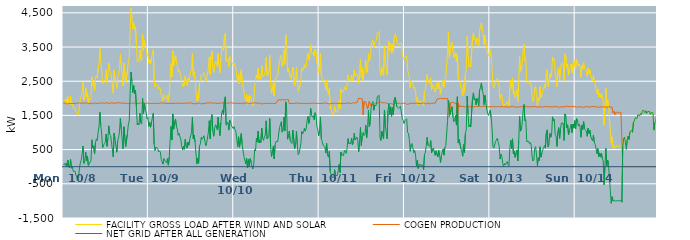
| Category | FACILITY GROSS LOAD AFTER WIND AND SOLAR | COGEN PRODUCTION | NET GRID AFTER ALL GENERATION |
|---|---|---|---|
|  Mon  10/8 | 1916 | 1858 | 58 |
|  Mon  10/8 | 1954 | 1864 | 90 |
|  Mon  10/8 | 1905 | 1864 | 41 |
|  Mon  10/8 | 1982 | 1869 | 113 |
|  Mon  10/8 | 1825 | 1829 | -4 |
|  Mon  10/8 | 2046 | 1855 | 191 |
|  Mon  10/8 | 1863 | 1859 | 4 |
|  Mon  10/8 | 1815 | 1852 | -37 |
|  Mon  10/8 | 2062 | 1845 | 217 |
|  Mon  10/8 | 1803 | 1845 | -42 |
|  Mon  10/8 | 1870 | 1849 | 21 |
|  Mon  10/8 | 1719 | 1852 | -133 |
|  Mon  10/8 | 1719 | 1853 | -134 |
|  Mon  10/8 | 1723 | 1854 | -131 |
|  Mon  10/8 | 1598 | 1844 | -246 |
|  Mon  10/8 | 1568 | 1858 | -290 |
|  Mon  10/8 | 1499 | 1867 | -368 |
|  Mon  10/8 | 1539 | 1866 | -327 |
|  Mon  10/8 | 1831 | 1863 | -32 |
|  Mon  10/8 | 1964 | 1862 | 102 |
|  Mon  10/8 | 2047 | 1858 | 189 |
|  Mon  10/8 | 2208 | 1838 | 370 |
|  Mon  10/8 | 2467 | 1862 | 605 |
|  Mon  10/8 | 1945 | 1851 | 94 |
|  Mon  10/8 | 2002 | 1858 | 144 |
|  Mon  10/8 | 2306 | 1879 | 427 |
|  Mon  10/8 | 2045 | 1870 | 175 |
|  Mon  10/8 | 2175 | 1864 | 311 |
|  Mon  10/8 | 1878 | 1841 | 37 |
|  Mon  10/8 | 1938 | 1856 | 82 |
|  Mon  10/8 | 1921 | 1861 | 60 |
|  Mon  10/8 | 2025 | 1837 | 188 |
|  Mon  10/8 | 2629 | 1840 | 789 |
|  Mon  10/8 | 2388 | 1840 | 548 |
|  Mon  10/8 | 2460 | 1851 | 609 |
|  Mon  10/8 | 2218 | 1845 | 373 |
|  Mon  10/8 | 2560 | 1864 | 696 |
|  Mon  10/8 | 2677 | 1863 | 814 |
|  Mon  10/8 | 2604 | 1840 | 764 |
|  Mon  10/8 | 2855 | 1854 | 1001 |
|  Mon  10/8 | 3028 | 1864 | 1164 |
|  Mon  10/8 | 3457 | 1863 | 1594 |
|  Mon  10/8 | 3061 | 1859 | 1202 |
|  Mon  10/8 | 2814 | 1862 | 952 |
|  Mon  10/8 | 2429 | 1870 | 559 |
|  Mon  10/8 | 2475 | 1851 | 624 |
|  Mon  10/8 | 2520 | 1847 | 673 |
|  Mon  10/8 | 2567 | 1855 | 712 |
|  Mon  10/8 | 2832 | 1875 | 957 |
|  Mon  10/8 | 2453 | 1855 | 598 |
|  Mon  10/8 | 2678 | 1850 | 828 |
|  Mon  10/8 | 3032 | 1835 | 1197 |
|  Mon  10/8 | 2811 | 1860 | 951 |
|  Mon  10/8 | 2771 | 1858 | 913 |
|  Mon  10/8 | 2593 | 1868 | 725 |
|  Mon  10/8 | 2585 | 1857 | 728 |
|  Mon  10/8 | 2148 | 1864 | 284 |
|  Mon  10/8 | 2828 | 1845 | 983 |
|  Mon  10/8 | 2646 | 1852 | 794 |
|  Mon  10/8 | 2648 | 1845 | 803 |
|  Mon  10/8 | 2292 | 1869 | 423 |
|  Mon  10/8 | 2605 | 1850 | 755 |
|  Mon  10/8 | 2713 | 1868 | 845 |
|  Mon  10/8 | 2859 | 1840 | 1019 |
|  Mon  10/8 | 3284 | 1870 | 1414 |
|  Mon  10/8 | 2964 | 1855 | 1109 |
|  Mon  10/8 | 2939 | 1850 | 1089 |
|  Mon  10/8 | 2366 | 1846 | 520 |
|  Mon  10/8 | 3030 | 1861 | 1169 |
|  Mon  10/8 | 3041 | 1856 | 1185 |
|  Mon  10/8 | 2445 | 1857 | 588 |
|  Mon  10/8 | 2440 | 1850 | 590 |
|  Mon  10/8 | 2817 | 1847 | 970 |
|  Mon  10/8 | 3097 | 1853 | 1244 |
|  Mon  10/8 | 3181 | 1843 | 1338 |
|  Mon  10/8 | 4002 | 1862 | 2140 |
|  Mon  10/8 | 4632 | 1862 | 2770 |
|  Mon  10/8 | 4355 | 1852 | 2503 |
|  Mon  10/8 | 4017 | 1850 | 2167 |
|  Mon  10/8 | 4204 | 1833 | 2371 |
|  Mon  10/8 | 4003 | 1864 | 2139 |
|  Mon  10/8 | 4082 | 1845 | 2237 |
|  Mon  10/8 | 3613 | 1854 | 1759 |
|  Mon  10/8 | 3076 | 1855 | 1221 |
|  Mon  10/8 | 3118 | 1845 | 1273 |
|  Mon  10/8 | 3082 | 1859 | 1223 |
|  Mon  10/8 | 3428 | 1864 | 1564 |
|  Mon  10/8 | 3139 | 1855 | 1284 |
|  Mon  10/8 | 3108 | 1861 | 1247 |
|  Mon  10/8 | 3863 | 1864 | 1999 |
|  Mon  10/8 | 3408 | 1854 | 1554 |
|  Mon  10/8 | 3697 | 1835 | 1862 |
|  Mon  10/8 | 3520 | 1855 | 1665 |
|  Mon  10/8 | 3458 | 1860 | 1598 |
|  Mon  10/8 | 3262 | 1863 | 1399 |
|  Mon  10/8 | 3296 | 1855 | 1441 |
|  Tue  10/9 | 3029 | 1852 | 1177 |
|  Tue  10/9 | 3132 | 1838 | 1294 |
|  Tue  10/9 | 2998 | 1842 | 1156 |
|  Tue  10/9 | 3168 | 1870 | 1298 |
|  Tue  10/9 | 3157 | 1857 | 1300 |
|  Tue  10/9 | 3418 | 1855 | 1563 |
|  Tue  10/9 | 2508 | 1850 | 658 |
|  Tue  10/9 | 2326 | 1849 | 477 |
|  Tue  10/9 | 2414 | 1842 | 572 |
|  Tue  10/9 | 2391 | 1843 | 548 |
|  Tue  10/9 | 2389 | 1853 | 536 |
|  Tue  10/9 | 2272 | 1841 | 431 |
|  Tue  10/9 | 2312 | 1849 | 463 |
|  Tue  10/9 | 2280 | 1851 | 429 |
|  Tue  10/9 | 2083 | 1869 | 214 |
|  Tue  10/9 | 2067 | 1859 | 208 |
|  Tue  10/9 | 1937 | 1862 | 75 |
|  Tue  10/9 | 2107 | 1871 | 236 |
|  Tue  10/9 | 2041 | 1859 | 182 |
|  Tue  10/9 | 2028 | 1856 | 172 |
|  Tue  10/9 | 1965 | 1850 | 115 |
|  Tue  10/9 | 2098 | 1862 | 236 |
|  Tue  10/9 | 1895 | 1848 | 47 |
|  Tue  10/9 | 2135 | 1851 | 284 |
|  Tue  10/9 | 2615 | 1855 | 760 |
|  Tue  10/9 | 3014 | 1837 | 1177 |
|  Tue  10/9 | 2629 | 1850 | 779 |
|  Tue  10/9 | 3391 | 1847 | 1544 |
|  Tue  10/9 | 2953 | 1855 | 1098 |
|  Tue  10/9 | 3174 | 1867 | 1307 |
|  Tue  10/9 | 3247 | 1854 | 1393 |
|  Tue  10/9 | 3057 | 1868 | 1189 |
|  Tue  10/9 | 2959 | 1855 | 1104 |
|  Tue  10/9 | 2778 | 1859 | 919 |
|  Tue  10/9 | 2840 | 1863 | 977 |
|  Tue  10/9 | 2823 | 1855 | 968 |
|  Tue  10/9 | 2643 | 1852 | 791 |
|  Tue  10/9 | 2454 | 1842 | 612 |
|  Tue  10/9 | 2338 | 1850 | 488 |
|  Tue  10/9 | 2445 | 1847 | 598 |
|  Tue  10/9 | 2370 | 1859 | 511 |
|  Tue  10/9 | 2658 | 1859 | 799 |
|  Tue  10/9 | 2468 | 1857 | 611 |
|  Tue  10/9 | 2385 | 1842 | 543 |
|  Tue  10/9 | 2581 | 1860 | 721 |
|  Tue  10/9 | 2473 | 1845 | 628 |
|  Tue  10/9 | 2660 | 1868 | 792 |
|  Tue  10/9 | 2631 | 1848 | 783 |
|  Tue  10/9 | 2863 | 1858 | 1005 |
|  Tue  10/9 | 3316 | 1866 | 1450 |
|  Tue  10/9 | 2661 | 1843 | 818 |
|  Tue  10/9 | 2788 | 1861 | 927 |
|  Tue  10/9 | 2562 | 1840 | 722 |
|  Tue  10/9 | 2589 | 1867 | 722 |
|  Tue  10/9 | 1919 | 1842 | 77 |
|  Tue  10/9 | 2103 | 1856 | 247 |
|  Tue  10/9 | 1963 | 1861 | 102 |
|  Tue  10/9 | 2458 | 1852 | 606 |
|  Tue  10/9 | 2527 | 1859 | 668 |
|  Tue  10/9 | 2683 | 1824 | 859 |
|  Tue  10/9 | 2652 | 1852 | 800 |
|  Tue  10/9 | 2687 | 1859 | 828 |
|  Tue  10/9 | 2761 | 1856 | 905 |
|  Tue  10/9 | 2723 | 1846 | 877 |
|  Tue  10/9 | 2473 | 1858 | 615 |
|  Tue  10/9 | 2555 | 1867 | 688 |
|  Tue  10/9 | 2534 | 1853 | 681 |
|  Tue  10/9 | 2866 | 1857 | 1009 |
|  Tue  10/9 | 3198 | 1854 | 1344 |
|  Tue  10/9 | 2695 | 1880 | 815 |
|  Tue  10/9 | 3242 | 1865 | 1377 |
|  Tue  10/9 | 3379 | 1854 | 1525 |
|  Tue  10/9 | 2906 | 1869 | 1037 |
|  Tue  10/9 | 2753 | 1862 | 891 |
|  Tue  10/9 | 2963 | 1852 | 1111 |
|  Tue  10/9 | 3089 | 1862 | 1227 |
|  Tue  10/9 | 3044 | 1852 | 1192 |
|  Tue  10/9 | 2925 | 1848 | 1077 |
|  Tue  10/9 | 3304 | 1852 | 1452 |
|  Tue  10/9 | 2970 | 1855 | 1115 |
|  Tue  10/9 | 2755 | 1846 | 909 |
|  Tue  10/9 | 3160 | 1870 | 1290 |
|  Tue  10/9 | 3436 | 1861 | 1575 |
|  Tue  10/9 | 3513 | 1856 | 1657 |
|  Tue  10/9 | 3392 | 1862 | 1530 |
|  Tue  10/9 | 3798 | 1872 | 1926 |
|  Tue  10/9 | 3895 | 1850 | 2045 |
|  Tue  10/9 | 3068 | 1853 | 1215 |
|  Tue  10/9 | 3064 | 1849 | 1215 |
|  Tue  10/9 | 3164 | 1857 | 1307 |
|  Tue  10/9 | 2926 | 1856 | 1070 |
|  Tue  10/9 | 3224 | 1865 | 1359 |
|  Tue  10/9 | 3163 | 1865 | 1298 |
|  Tue  10/9 | 3064 | 1870 | 1194 |
|  Tue  10/9 | 3067 | 1868 | 1199 |
|  Tue  10/9 | 2973 | 1859 | 1114 |
|  Wed  10/10 | 3030 | 1856 | 1174 |
|  Wed  10/10 | 2926 | 1851 | 1075 |
|  Wed  10/10 | 2868 | 1848 | 1020 |
|  Wed  10/10 | 2844 | 1853 | 991 |
|  Wed  10/10 | 2446 | 1862 | 584 |
|  Wed  10/10 | 2725 | 1850 | 875 |
|  Wed  10/10 | 2425 | 1860 | 565 |
|  Wed  10/10 | 2408 | 1853 | 555 |
|  Wed  10/10 | 2833 | 1862 | 971 |
|  Wed  10/10 | 2499 | 1849 | 650 |
|  Wed  10/10 | 2318 | 1854 | 464 |
|  Wed  10/10 | 2180 | 1881 | 299 |
|  Wed  10/10 | 2031 | 1837 | 194 |
|  Wed  10/10 | 1935 | 1855 | 80 |
|  Wed  10/10 | 2114 | 1869 | 245 |
|  Wed  10/10 | 1815 | 1848 | -33 |
|  Wed  10/10 | 2068 | 1858 | 210 |
|  Wed  10/10 | 1859 | 1847 | 12 |
|  Wed  10/10 | 2088 | 1848 | 240 |
|  Wed  10/10 | 1999 | 1854 | 145 |
|  Wed  10/10 | 1859 | 1863 | -4 |
|  Wed  10/10 | 1783 | 1852 | -69 |
|  Wed  10/10 | 1930 | 1861 | 69 |
|  Wed  10/10 | 2348 | 1850 | 498 |
|  Wed  10/10 | 2331 | 1868 | 463 |
|  Wed  10/10 | 2685 | 1854 | 831 |
|  Wed  10/10 | 2577 | 1857 | 720 |
|  Wed  10/10 | 2890 | 1847 | 1043 |
|  Wed  10/10 | 2550 | 1854 | 696 |
|  Wed  10/10 | 2640 | 1865 | 775 |
|  Wed  10/10 | 2568 | 1861 | 707 |
|  Wed  10/10 | 2955 | 1827 | 1128 |
|  Wed  10/10 | 2691 | 1853 | 838 |
|  Wed  10/10 | 2621 | 1851 | 770 |
|  Wed  10/10 | 2712 | 1839 | 873 |
|  Wed  10/10 | 2789 | 1859 | 930 |
|  Wed  10/10 | 3205 | 1863 | 1342 |
|  Wed  10/10 | 2656 | 1841 | 815 |
|  Wed  10/10 | 2660 | 1863 | 797 |
|  Wed  10/10 | 2743 | 1860 | 883 |
|  Wed  10/10 | 3264 | 1851 | 1413 |
|  Wed  10/10 | 2429 | 1847 | 582 |
|  Wed  10/10 | 2151 | 1855 | 296 |
|  Wed  10/10 | 2303 | 1852 | 451 |
|  Wed  10/10 | 2455 | 1854 | 601 |
|  Wed  10/10 | 2075 | 1846 | 229 |
|  Wed  10/10 | 2503 | 1862 | 641 |
|  Wed  10/10 | 2591 | 1855 | 736 |
|  Wed  10/10 | 2594 | 1856 | 738 |
|  Wed  10/10 | 2679 | 1945 | 734 |
|  Wed  10/10 | 2708 | 1968 | 740 |
|  Wed  10/10 | 3101 | 1954 | 1147 |
|  Wed  10/10 | 3182 | 1957 | 1225 |
|  Wed  10/10 | 3267 | 1954 | 1313 |
|  Wed  10/10 | 2940 | 1930 | 1010 |
|  Wed  10/10 | 3012 | 1960 | 1052 |
|  Wed  10/10 | 3414 | 1964 | 1450 |
|  Wed  10/10 | 2997 | 1951 | 1046 |
|  Wed  10/10 | 3857 | 1962 | 1895 |
|  Wed  10/10 | 3615 | 1964 | 1651 |
|  Wed  10/10 | 2764 | 1959 | 805 |
|  Wed  10/10 | 2871 | 1959 | 912 |
|  Wed  10/10 | 2886 | 1843 | 1043 |
|  Wed  10/10 | 2631 | 1858 | 773 |
|  Wed  10/10 | 2559 | 1851 | 708 |
|  Wed  10/10 | 2549 | 1871 | 678 |
|  Wed  10/10 | 2916 | 1846 | 1070 |
|  Wed  10/10 | 2940 | 1857 | 1083 |
|  Wed  10/10 | 2376 | 1853 | 523 |
|  Wed  10/10 | 2498 | 1854 | 644 |
|  Wed  10/10 | 2905 | 1862 | 1043 |
|  Wed  10/10 | 2525 | 1881 | 644 |
|  Wed  10/10 | 2208 | 1860 | 348 |
|  Wed  10/10 | 2253 | 1861 | 392 |
|  Wed  10/10 | 2243 | 1840 | 403 |
|  Wed  10/10 | 2522 | 1851 | 671 |
|  Wed  10/10 | 2887 | 1858 | 1029 |
|  Wed  10/10 | 2820 | 1858 | 962 |
|  Wed  10/10 | 2852 | 1850 | 1002 |
|  Wed  10/10 | 2986 | 1854 | 1132 |
|  Wed  10/10 | 2885 | 1846 | 1039 |
|  Wed  10/10 | 2945 | 1828 | 1117 |
|  Wed  10/10 | 3197 | 1859 | 1338 |
|  Wed  10/10 | 3328 | 1852 | 1476 |
|  Wed  10/10 | 3117 | 1848 | 1269 |
|  Wed  10/10 | 3222 | 1843 | 1379 |
|  Wed  10/10 | 3564 | 1856 | 1708 |
|  Wed  10/10 | 3369 | 1853 | 1516 |
|  Wed  10/10 | 3303 | 1856 | 1447 |
|  Wed  10/10 | 3344 | 1850 | 1494 |
|  Wed  10/10 | 3230 | 1862 | 1368 |
|  Wed  10/10 | 3441 | 1861 | 1580 |
|  Wed  10/10 | 3372 | 1842 | 1530 |
|  Wed  10/10 | 3022 | 1845 | 1177 |
|  Wed  10/10 | 2950 | 1854 | 1096 |
|  Wed  10/10 | 2757 | 1855 | 902 |
|  Thu  10/11 | 2899 | 1850 | 1049 |
|  Thu  10/11 | 3320 | 1863 | 1457 |
|  Thu  10/11 | 2670 | 1851 | 819 |
|  Thu  10/11 | 2589 | 1855 | 734 |
|  Thu  10/11 | 2483 | 1851 | 632 |
|  Thu  10/11 | 2489 | 1843 | 646 |
|  Thu  10/11 | 2450 | 1865 | 585 |
|  Thu  10/11 | 2248 | 1849 | 399 |
|  Thu  10/11 | 2540 | 1857 | 683 |
|  Thu  10/11 | 2201 | 1862 | 339 |
|  Thu  10/11 | 2117 | 1839 | 278 |
|  Thu  10/11 | 2302 | 1852 | 450 |
|  Thu  10/11 | 1695 | 1840 | -145 |
|  Thu  10/11 | 1745 | 1861 | -116 |
|  Thu  10/11 | 1565 | 1852 | -287 |
|  Thu  10/11 | 1513 | 1841 | -328 |
|  Thu  10/11 | 1571 | 1860 | -289 |
|  Thu  10/11 | 1762 | 1849 | -87 |
|  Thu  10/11 | 1595 | 1852 | -257 |
|  Thu  10/11 | 1584 | 1849 | -265 |
|  Thu  10/11 | 1601 | 1857 | -256 |
|  Thu  10/11 | 1734 | 1854 | -120 |
|  Thu  10/11 | 1926 | 1858 | 68 |
|  Thu  10/11 | 1691 | 1859 | -168 |
|  Thu  10/11 | 2273 | 1843 | 430 |
|  Thu  10/11 | 2187 | 1857 | 330 |
|  Thu  10/11 | 2215 | 1852 | 363 |
|  Thu  10/11 | 2195 | 1871 | 324 |
|  Thu  10/11 | 2340 | 1852 | 488 |
|  Thu  10/11 | 2369 | 1862 | 507 |
|  Thu  10/11 | 2241 | 1849 | 392 |
|  Thu  10/11 | 2402 | 1864 | 538 |
|  Thu  10/11 | 2690 | 1869 | 821 |
|  Thu  10/11 | 2521 | 1847 | 674 |
|  Thu  10/11 | 2502 | 1853 | 649 |
|  Thu  10/11 | 2535 | 1857 | 678 |
|  Thu  10/11 | 2686 | 1849 | 837 |
|  Thu  10/11 | 2508 | 1872 | 636 |
|  Thu  10/11 | 2607 | 1869 | 738 |
|  Thu  10/11 | 2829 | 1849 | 980 |
|  Thu  10/11 | 2644 | 1864 | 780 |
|  Thu  10/11 | 2637 | 1855 | 782 |
|  Thu  10/11 | 2735 | 1869 | 866 |
|  Thu  10/11 | 2610 | 1843 | 767 |
|  Thu  10/11 | 2441 | 2004 | 437 |
|  Thu  10/11 | 2735 | 1994 | 741 |
|  Thu  10/11 | 3139 | 1991 | 1148 |
|  Thu  10/11 | 2607 | 1985 | 622 |
|  Thu  10/11 | 2894 | 1989 | 905 |
|  Thu  10/11 | 2517 | 1515 | 1002 |
|  Thu  10/11 | 2811 | 1905 | 906 |
|  Thu  10/11 | 2852 | 1912 | 940 |
|  Thu  10/11 | 3107 | 1895 | 1212 |
|  Thu  10/11 | 2750 | 1901 | 849 |
|  Thu  10/11 | 2796 | 1688 | 1108 |
|  Thu  10/11 | 3313 | 1666 | 1647 |
|  Thu  10/11 | 3087 | 1914 | 1173 |
|  Thu  10/11 | 3203 | 1905 | 1298 |
|  Thu  10/11 | 3507 | 1774 | 1733 |
|  Thu  10/11 | 3660 | 1813 | 1847 |
|  Thu  10/11 | 3714 | 1811 | 1903 |
|  Thu  10/11 | 3476 | 1823 | 1653 |
|  Thu  10/11 | 3647 | 1843 | 1804 |
|  Thu  10/11 | 3629 | 1856 | 1773 |
|  Thu  10/11 | 3694 | 1858 | 1836 |
|  Thu  10/11 | 3907 | 1854 | 2053 |
|  Thu  10/11 | 3923 | 1848 | 2075 |
|  Thu  10/11 | 3960 | 1875 | 2085 |
|  Thu  10/11 | 2759 | 1892 | 867 |
|  Thu  10/11 | 2665 | 1898 | 767 |
|  Thu  10/11 | 2909 | 1869 | 1040 |
|  Thu  10/11 | 2755 | 1859 | 896 |
|  Thu  10/11 | 2661 | 1845 | 816 |
|  Thu  10/11 | 3540 | 1881 | 1659 |
|  Thu  10/11 | 3077 | 1852 | 1225 |
|  Thu  10/11 | 2862 | 1854 | 1008 |
|  Thu  10/11 | 2681 | 1864 | 817 |
|  Thu  10/11 | 3492 | 1850 | 1642 |
|  Thu  10/11 | 3676 | 1846 | 1830 |
|  Thu  10/11 | 3374 | 1850 | 1524 |
|  Thu  10/11 | 3602 | 1853 | 1749 |
|  Thu  10/11 | 3312 | 1842 | 1470 |
|  Thu  10/11 | 3574 | 1847 | 1727 |
|  Thu  10/11 | 3346 | 1825 | 1521 |
|  Thu  10/11 | 3802 | 1848 | 1954 |
|  Thu  10/11 | 3883 | 1850 | 2033 |
|  Thu  10/11 | 3845 | 1840 | 2005 |
|  Thu  10/11 | 3607 | 1850 | 1757 |
|  Thu  10/11 | 3583 | 1850 | 1733 |
|  Thu  10/11 | 3567 | 1862 | 1705 |
|  Thu  10/11 | 3607 | 1869 | 1738 |
|  Thu  10/11 | 3607 | 1839 | 1768 |
|  Thu  10/11 | 3613 | 1844 | 1769 |
|  Thu  10/11 | 3266 | 1849 | 1417 |
|  Thu  10/11 | 3194 | 1837 | 1357 |
|  Thu  10/11 | 3126 | 1863 | 1263 |
|  Fri  10/12 | 3202 | 1859 | 1343 |
|  Fri  10/12 | 3211 | 1839 | 1372 |
|  Fri  10/12 | 3242 | 1843 | 1399 |
|  Fri  10/12 | 2833 | 1826 | 1007 |
|  Fri  10/12 | 2821 | 1846 | 975 |
|  Fri  10/12 | 2635 | 1840 | 795 |
|  Fri  10/12 | 2304 | 1853 | 451 |
|  Fri  10/12 | 2514 | 1864 | 650 |
|  Fri  10/12 | 2522 | 1842 | 680 |
|  Fri  10/12 | 2395 | 1844 | 551 |
|  Fri  10/12 | 2277 | 1871 | 406 |
|  Fri  10/12 | 2331 | 1855 | 476 |
|  Fri  10/12 | 2193 | 1855 | 338 |
|  Fri  10/12 | 1881 | 1864 | 17 |
|  Fri  10/12 | 2029 | 1836 | 193 |
|  Fri  10/12 | 1799 | 1848 | -49 |
|  Fri  10/12 | 1869 | 1848 | 21 |
|  Fri  10/12 | 1934 | 1855 | 79 |
|  Fri  10/12 | 1878 | 1841 | 37 |
|  Fri  10/12 | 1869 | 1849 | 20 |
|  Fri  10/12 | 1892 | 1842 | 50 |
|  Fri  10/12 | 1782 | 1868 | -86 |
|  Fri  10/12 | 2200 | 1858 | 342 |
|  Fri  10/12 | 2268 | 1844 | 424 |
|  Fri  10/12 | 2432 | 1830 | 602 |
|  Fri  10/12 | 2691 | 1834 | 857 |
|  Fri  10/12 | 2499 | 1873 | 626 |
|  Fri  10/12 | 2495 | 1865 | 630 |
|  Fri  10/12 | 2427 | 1838 | 589 |
|  Fri  10/12 | 2603 | 1835 | 768 |
|  Fri  10/12 | 2263 | 1854 | 409 |
|  Fri  10/12 | 2253 | 1863 | 390 |
|  Fri  10/12 | 2406 | 1858 | 548 |
|  Fri  10/12 | 2418 | 1849 | 569 |
|  Fri  10/12 | 2181 | 1852 | 329 |
|  Fri  10/12 | 2324 | 1860 | 464 |
|  Fri  10/12 | 2454 | 1973 | 481 |
|  Fri  10/12 | 2274 | 1987 | 287 |
|  Fri  10/12 | 2464 | 1988 | 476 |
|  Fri  10/12 | 2325 | 1992 | 333 |
|  Fri  10/12 | 2120 | 1998 | 122 |
|  Fri  10/12 | 2318 | 1995 | 323 |
|  Fri  10/12 | 2426 | 1996 | 430 |
|  Fri  10/12 | 2514 | 1997 | 517 |
|  Fri  10/12 | 2326 | 1988 | 338 |
|  Fri  10/12 | 2545 | 1982 | 563 |
|  Fri  10/12 | 2616 | 1994 | 622 |
|  Fri  10/12 | 2629 | 1996 | 633 |
|  Fri  10/12 | 3341 | 1996 | 1345 |
|  Fri  10/12 | 3938 | 2000 | 1938 |
|  Fri  10/12 | 3168 | 1450 | 1718 |
|  Fri  10/12 | 3386 | 1864 | 1522 |
|  Fri  10/12 | 3569 | 1885 | 1684 |
|  Fri  10/12 | 3636 | 1881 | 1755 |
|  Fri  10/12 | 3367 | 1906 | 1461 |
|  Fri  10/12 | 3196 | 1880 | 1316 |
|  Fri  10/12 | 3219 | 1848 | 1371 |
|  Fri  10/12 | 3349 | 1854 | 1495 |
|  Fri  10/12 | 3077 | 1860 | 1217 |
|  Fri  10/12 | 3295 | 1249 | 2046 |
|  Fri  10/12 | 2559 | 1868 | 691 |
|  Fri  10/12 | 2559 | 1760 | 799 |
|  Fri  10/12 | 2524 | 1750 | 774 |
|  Fri  10/12 | 2288 | 1766 | 522 |
|  Fri  10/12 | 2208 | 1760 | 448 |
|  Fri  10/12 | 2072 | 1765 | 307 |
|  Fri  10/12 | 2409 | 1761 | 648 |
|  Fri  10/12 | 2167 | 1751 | 416 |
|  Fri  10/12 | 2727 | 1758 | 969 |
|  Fri  10/12 | 2830 | 1751 | 1079 |
|  Fri  10/12 | 3817 | 1751 | 2066 |
|  Fri  10/12 | 3302 | 1753 | 1549 |
|  Fri  10/12 | 2922 | 1755 | 1167 |
|  Fri  10/12 | 2976 | 1755 | 1221 |
|  Fri  10/12 | 2921 | 1756 | 1165 |
|  Fri  10/12 | 2938 | 1756 | 1182 |
|  Fri  10/12 | 3763 | 1772 | 1991 |
|  Fri  10/12 | 3912 | 1750 | 2162 |
|  Fri  10/12 | 3711 | 1759 | 1952 |
|  Fri  10/12 | 3745 | 1756 | 1989 |
|  Fri  10/12 | 3574 | 1762 | 1812 |
|  Fri  10/12 | 3756 | 1761 | 1995 |
|  Fri  10/12 | 3684 | 1760 | 1924 |
|  Fri  10/12 | 3540 | 1760 | 1780 |
|  Fri  10/12 | 3985 | 1750 | 2235 |
|  Fri  10/12 | 4077 | 1753 | 2324 |
|  Fri  10/12 | 4206 | 1755 | 2451 |
|  Fri  10/12 | 3998 | 1767 | 2231 |
|  Fri  10/12 | 3895 | 1751 | 2144 |
|  Fri  10/12 | 3579 | 1766 | 1813 |
|  Fri  10/12 | 3850 | 1762 | 2088 |
|  Fri  10/12 | 3654 | 1759 | 1895 |
|  Fri  10/12 | 3450 | 1761 | 1689 |
|  Fri  10/12 | 3320 | 1755 | 1565 |
|  Fri  10/12 | 3238 | 1738 | 1500 |
|  Fri  10/12 | 3257 | 1747 | 1510 |
|  Sat  10/13 | 3422 | 1769 | 1653 |
|  Sat  10/13 | 3205 | 1761 | 1444 |
|  Sat  10/13 | 2871 | 1738 | 1133 |
|  Sat  10/13 | 2354 | 1755 | 599 |
|  Sat  10/13 | 2305 | 1758 | 547 |
|  Sat  10/13 | 2307 | 1753 | 554 |
|  Sat  10/13 | 2483 | 1748 | 735 |
|  Sat  10/13 | 2475 | 1746 | 729 |
|  Sat  10/13 | 2592 | 1756 | 836 |
|  Sat  10/13 | 2471 | 1763 | 708 |
|  Sat  10/13 | 2364 | 1755 | 609 |
|  Sat  10/13 | 1970 | 1746 | 224 |
|  Sat  10/13 | 2117 | 1752 | 365 |
|  Sat  10/13 | 2072 | 1767 | 305 |
|  Sat  10/13 | 1855 | 1756 | 99 |
|  Sat  10/13 | 1760 | 1752 | 8 |
|  Sat  10/13 | 1839 | 1745 | 94 |
|  Sat  10/13 | 1802 | 1750 | 52 |
|  Sat  10/13 | 1777 | 1748 | 29 |
|  Sat  10/13 | 1904 | 1752 | 152 |
|  Sat  10/13 | 1818 | 1754 | 64 |
|  Sat  10/13 | 1766 | 1741 | 25 |
|  Sat  10/13 | 2295 | 1766 | 529 |
|  Sat  10/13 | 2536 | 1759 | 777 |
|  Sat  10/13 | 2282 | 1759 | 523 |
|  Sat  10/13 | 2581 | 1766 | 815 |
|  Sat  10/13 | 2139 | 1757 | 382 |
|  Sat  10/13 | 2201 | 1751 | 450 |
|  Sat  10/13 | 2019 | 1745 | 274 |
|  Sat  10/13 | 2143 | 1742 | 401 |
|  Sat  10/13 | 2254 | 1764 | 490 |
|  Sat  10/13 | 1908 | 1740 | 168 |
|  Sat  10/13 | 2503 | 1746 | 757 |
|  Sat  10/13 | 3222 | 1751 | 1471 |
|  Sat  10/13 | 2787 | 1747 | 1040 |
|  Sat  10/13 | 2839 | 1754 | 1085 |
|  Sat  10/13 | 3060 | 1755 | 1305 |
|  Sat  10/13 | 3425 | 1749 | 1676 |
|  Sat  10/13 | 3581 | 1761 | 1820 |
|  Sat  10/13 | 3092 | 1753 | 1339 |
|  Sat  10/13 | 3133 | 1760 | 1373 |
|  Sat  10/13 | 2488 | 1754 | 734 |
|  Sat  10/13 | 2446 | 1730 | 716 |
|  Sat  10/13 | 2496 | 1750 | 746 |
|  Sat  10/13 | 2423 | 1746 | 677 |
|  Sat  10/13 | 2460 | 1749 | 711 |
|  Sat  10/13 | 2385 | 1751 | 634 |
|  Sat  10/13 | 2054 | 1763 | 291 |
|  Sat  10/13 | 1911 | 1745 | 166 |
|  Sat  10/13 | 1952 | 1752 | 200 |
|  Sat  10/13 | 2303 | 1760 | 543 |
|  Sat  10/13 | 2352 | 1764 | 588 |
|  Sat  10/13 | 2112 | 1764 | 348 |
|  Sat  10/13 | 1774 | 1742 | 32 |
|  Sat  10/13 | 2015 | 1754 | 261 |
|  Sat  10/13 | 1937 | 1759 | 178 |
|  Sat  10/13 | 2342 | 1760 | 582 |
|  Sat  10/13 | 2029 | 1750 | 279 |
|  Sat  10/13 | 2130 | 1739 | 391 |
|  Sat  10/13 | 2235 | 1738 | 497 |
|  Sat  10/13 | 2296 | 1756 | 540 |
|  Sat  10/13 | 2398 | 1773 | 625 |
|  Sat  10/13 | 2283 | 1740 | 543 |
|  Sat  10/13 | 2736 | 1756 | 980 |
|  Sat  10/13 | 2842 | 1764 | 1078 |
|  Sat  10/13 | 2349 | 1769 | 580 |
|  Sat  10/13 | 2413 | 1757 | 656 |
|  Sat  10/13 | 2730 | 1753 | 977 |
|  Sat  10/13 | 2610 | 1746 | 864 |
|  Sat  10/13 | 2702 | 1740 | 962 |
|  Sat  10/13 | 3212 | 1753 | 1459 |
|  Sat  10/13 | 3105 | 1768 | 1337 |
|  Sat  10/13 | 3143 | 1756 | 1387 |
|  Sat  10/13 | 2706 | 1771 | 935 |
|  Sat  10/13 | 2651 | 1751 | 900 |
|  Sat  10/13 | 2345 | 1752 | 593 |
|  Sat  10/13 | 2788 | 1760 | 1028 |
|  Sat  10/13 | 2893 | 1748 | 1145 |
|  Sat  10/13 | 2546 | 1724 | 822 |
|  Sat  10/13 | 2875 | 1761 | 1114 |
|  Sat  10/13 | 3014 | 1738 | 1276 |
|  Sat  10/13 | 3036 | 1743 | 1293 |
|  Sat  10/13 | 3007 | 1736 | 1271 |
|  Sat  10/13 | 2520 | 1751 | 769 |
|  Sat  10/13 | 3303 | 1759 | 1544 |
|  Sat  10/13 | 3253 | 1766 | 1487 |
|  Sat  10/13 | 2886 | 1752 | 1134 |
|  Sat  10/13 | 2991 | 1766 | 1225 |
|  Sat  10/13 | 2688 | 1751 | 937 |
|  Sat  10/13 | 2799 | 1756 | 1043 |
|  Sat  10/13 | 2908 | 1758 | 1150 |
|  Sat  10/13 | 3003 | 1764 | 1239 |
|  Sat  10/13 | 2750 | 1750 | 1000 |
|  Sat  10/13 | 3008 | 1759 | 1249 |
|  Sat  10/13 | 2899 | 1771 | 1128 |
|  Sat  10/13 | 3102 | 1755 | 1347 |
|  Sun  10/14 | 2878 | 1768 | 1110 |
|  Sun  10/14 | 3146 | 1737 | 1409 |
|  Sun  10/14 | 3118 | 1742 | 1376 |
|  Sun  10/14 | 2949 | 1754 | 1195 |
|  Sun  10/14 | 3003 | 1749 | 1254 |
|  Sun  10/14 | 2893 | 1748 | 1145 |
|  Sun  10/14 | 2616 | 1754 | 862 |
|  Sun  10/14 | 2961 | 1744 | 1217 |
|  Sun  10/14 | 2841 | 1756 | 1085 |
|  Sun  10/14 | 3054 | 1736 | 1318 |
|  Sun  10/14 | 2871 | 1760 | 1111 |
|  Sun  10/14 | 2862 | 1762 | 1100 |
|  Sun  10/14 | 2790 | 1747 | 1043 |
|  Sun  10/14 | 2642 | 1752 | 890 |
|  Sun  10/14 | 2880 | 1758 | 1122 |
|  Sun  10/14 | 2714 | 1741 | 973 |
|  Sun  10/14 | 2831 | 1762 | 1069 |
|  Sun  10/14 | 2632 | 1753 | 879 |
|  Sun  10/14 | 2622 | 1762 | 860 |
|  Sun  10/14 | 2514 | 1761 | 753 |
|  Sun  10/14 | 2675 | 1750 | 925 |
|  Sun  10/14 | 2467 | 1752 | 715 |
|  Sun  10/14 | 2416 | 1762 | 654 |
|  Sun  10/14 | 2282 | 1763 | 519 |
|  Sun  10/14 | 2137 | 1756 | 381 |
|  Sun  10/14 | 2268 | 1738 | 530 |
|  Sun  10/14 | 2043 | 1749 | 294 |
|  Sun  10/14 | 2146 | 1743 | 403 |
|  Sun  10/14 | 2023 | 1742 | 281 |
|  Sun  10/14 | 2149 | 1755 | 394 |
|  Sun  10/14 | 1992 | 1750 | 242 |
|  Sun  10/14 | 1911 | 1745 | 166 |
|  Sun  10/14 | 1222 | 1749 | -527 |
|  Sun  10/14 | 1780 | 1750 | 30 |
|  Sun  10/14 | 2293 | 1757 | 536 |
|  Sun  10/14 | 1754 | 1737 | 17 |
|  Sun  10/14 | 1958 | 1764 | 194 |
|  Sun  10/14 | 1824 | 1755 | 69 |
|  Sun  10/14 | 1424 | 1770 | -346 |
|  Sun  10/14 | 1058 | 1746 | -688 |
|  Sun  10/14 | 691 | 1760 | -1069 |
|  Sun  10/14 | 868 | 1746 | -878 |
|  Sun  10/14 | 570 | 1572 | -1002 |
|  Sun  10/14 | 611 | 1631 | -1020 |
|  Sun  10/14 | 535 | 1517 | -982 |
|  Sun  10/14 | 575 | 1591 | -1016 |
|  Sun  10/14 | 573 | 1561 | -988 |
|  Sun  10/14 | 620 | 1607 | -987 |
|  Sun  10/14 | 597 | 1587 | -990 |
|  Sun  10/14 | 561 | 1564 | -1003 |
|  Sun  10/14 | 573 | 1574 | -1001 |
|  Sun  10/14 | 614 | 1591 | -977 |
|  Sun  10/14 | 570 | 1610 | -1040 |
|  Sun  10/14 | 597 | 0 | 597 |
|  Sun  10/14 | 827 | 0 | 827 |
|  Sun  10/14 | 869 | 0 | 869 |
|  Sun  10/14 | 698 | 0 | 698 |
|  Sun  10/14 | 509 | 0 | 509 |
|  Sun  10/14 | 785 | 0 | 785 |
|  Sun  10/14 | 897 | 0 | 897 |
|  Sun  10/14 | 796 | 0 | 796 |
|  Sun  10/14 | 1016 | 0 | 1016 |
|  Sun  10/14 | 1008 | 0 | 1008 |
|  Sun  10/14 | 1073 | 0 | 1073 |
|  Sun  10/14 | 1007 | 0 | 1007 |
|  Sun  10/14 | 1305 | 0 | 1305 |
|  Sun  10/14 | 1335 | 0 | 1335 |
|  Sun  10/14 | 1433 | 0 | 1433 |
|  Sun  10/14 | 1443 | 0 | 1443 |
|  Sun  10/14 | 1405 | 0 | 1405 |
|  Sun  10/14 | 1529 | 0 | 1529 |
|  Sun  10/14 | 1501 | 0 | 1501 |
|  Sun  10/14 | 1487 | 0 | 1487 |
|  Sun  10/14 | 1558 | 0 | 1558 |
|  Sun  10/14 | 1525 | 0 | 1525 |
|  Sun  10/14 | 1622 | 0 | 1622 |
|  Sun  10/14 | 1659 | 0 | 1659 |
|  Sun  10/14 | 1670 | 0 | 1670 |
|  Sun  10/14 | 1575 | 0 | 1575 |
|  Sun  10/14 | 1639 | 0 | 1639 |
|  Sun  10/14 | 1560 | 0 | 1560 |
|  Sun  10/14 | 1615 | 0 | 1615 |
|  Sun  10/14 | 1641 | 0 | 1641 |
|  Sun  10/14 | 1619 | 0 | 1619 |
|  Sun  10/14 | 1528 | 0 | 1528 |
|  Sun  10/14 | 1592 | 0 | 1592 |
|  Sun  10/14 | 1575 | 0 | 1575 |
|  Sun  10/14 | 1573 | 0 | 1573 |
|  Sun  10/14 | 1069 | 0 | 1069 |
|  Sun  10/14 | 1281 | 0 | 1281 |
|  Sun  10/14 | 1318 | 0 | 1318 |
|  Sun  10/14 | 1522 | 0 | 1522 |